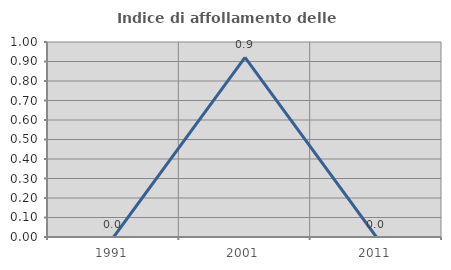
| Category | Indice di affollamento delle abitazioni  |
|---|---|
| 1991.0 | 0 |
| 2001.0 | 0.922 |
| 2011.0 | 0 |